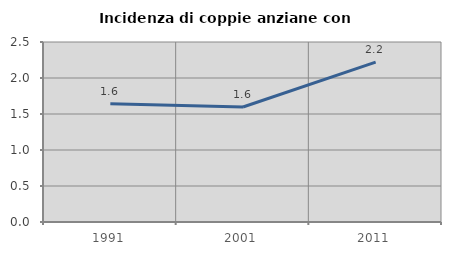
| Category | Incidenza di coppie anziane con figli |
|---|---|
| 1991.0 | 1.643 |
| 2001.0 | 1.598 |
| 2011.0 | 2.221 |